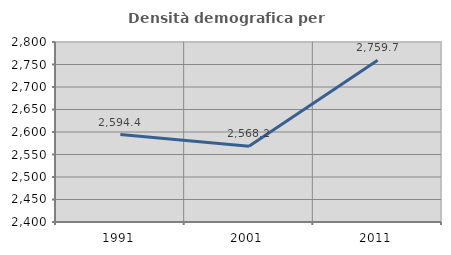
| Category | Densità demografica |
|---|---|
| 1991.0 | 2594.444 |
| 2001.0 | 2568.233 |
| 2011.0 | 2759.684 |